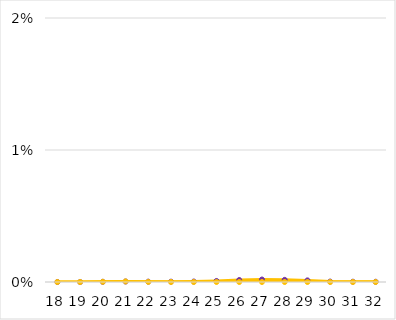
| Category | TE | Virus |
|---|---|---|
| 18.0 | 0 | 0 |
| 19.0 | 0 | 0 |
| 20.0 | 0 | 0 |
| 21.0 | 0 | 0 |
| 22.0 | 0 | 0 |
| 23.0 | 0 | 0 |
| 24.0 | 0 | 0 |
| 25.0 | 0 | 0 |
| 26.0 | 0 | 0 |
| 27.0 | 0 | 0 |
| 28.0 | 0 | 0 |
| 29.0 | 0 | 0 |
| 30.0 | 0 | 0 |
| 31.0 | 0 | 0 |
| 32.0 | 0 | 0 |